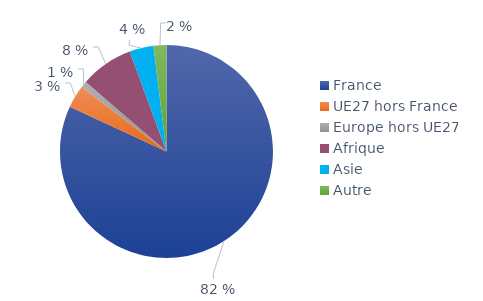
| Category | Series 0 |
|---|---|
| France | 0.819 |
| UE27 hors France | 0.034 |
| Europe hors UE27 | 0.01 |
| Afrique | 0.081 |
| Asie | 0.036 |
| Autre | 0.02 |